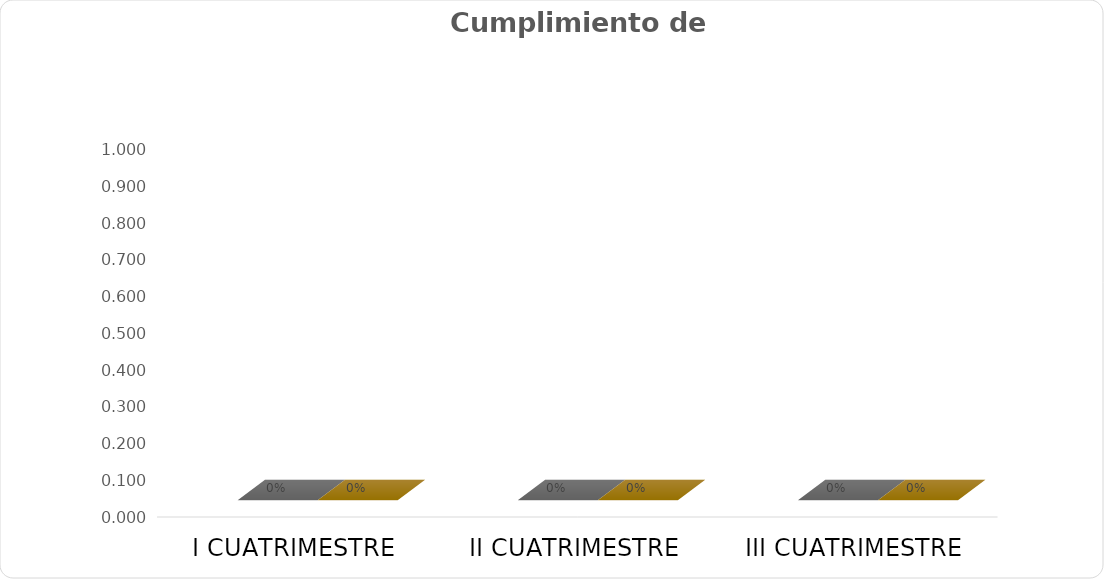
| Category | Cumplimiento de actividades | Acumulado o Promedio |
|---|---|---|
| I CUATRIMESTRE | 0 | 0 |
| II CUATRIMESTRE | 0 | 0 |
| III CUATRIMESTRE | 0 | 0 |